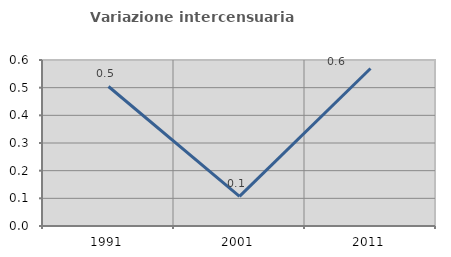
| Category | Variazione intercensuaria annua |
|---|---|
| 1991.0 | 0.504 |
| 2001.0 | 0.107 |
| 2011.0 | 0.569 |